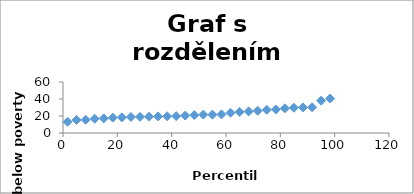
| Category | Series 0 |
|---|---|
| 1.6666666666666667 | 13.2 |
| 5.0 | 15.4 |
| 8.333333333333334 | 15.6 |
| 11.666666666666666 | 16.8 |
| 15.0 | 17.2 |
| 18.333333333333336 | 18.1 |
| 21.666666666666668 | 18.4 |
| 25.000000000000004 | 18.9 |
| 28.333333333333336 | 19 |
| 31.666666666666668 | 19.2 |
| 35.0 | 19.5 |
| 38.333333333333336 | 19.7 |
| 41.666666666666664 | 19.8 |
| 45.0 | 20.5 |
| 48.333333333333336 | 21.1 |
| 51.666666666666664 | 21.6 |
| 55.0 | 21.6 |
| 58.333333333333336 | 21.9 |
| 61.666666666666664 | 23.8 |
| 65.0 | 24.8 |
| 68.33333333333334 | 25.4 |
| 71.66666666666667 | 26.2 |
| 75.00000000000001 | 27.3 |
| 78.33333333333334 | 27.7 |
| 81.66666666666667 | 29 |
| 85.00000000000001 | 29.7 |
| 88.33333333333334 | 30.1 |
| 91.66666666666667 | 30.3 |
| 95.00000000000001 | 38 |
| 98.33333333333334 | 40.5 |